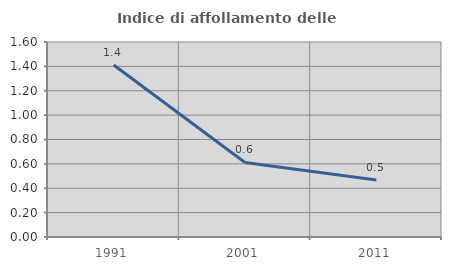
| Category | Indice di affollamento delle abitazioni  |
|---|---|
| 1991.0 | 1.412 |
| 2001.0 | 0.612 |
| 2011.0 | 0.468 |